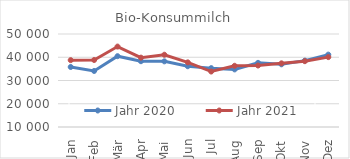
| Category | Jahr 2020 | Jahr 2021 |
|---|---|---|
| 0 | 35809.832 | 38757.551 |
| 1 | 34101.347 | 38814.64 |
| 2 | 40454.111 | 44593.689 |
| 3 | 38298.871 | 39826.494 |
| 4 | 38237.599 | 41083.307 |
| 5 | 36140.997 | 37798.798 |
| 6 | 35318.052 | 33859.335 |
| 7 | 34772.7 | 36328.055 |
| 8 | 37584.548 | 36445.81 |
| 9 | 36962.465 | 37380.96 |
| 10 | 38554.181 | 38310.104 |
| 11 | 41130.747 | 40061.621 |